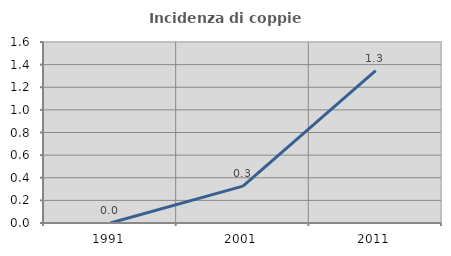
| Category | Incidenza di coppie miste |
|---|---|
| 1991.0 | 0 |
| 2001.0 | 0.326 |
| 2011.0 | 1.347 |